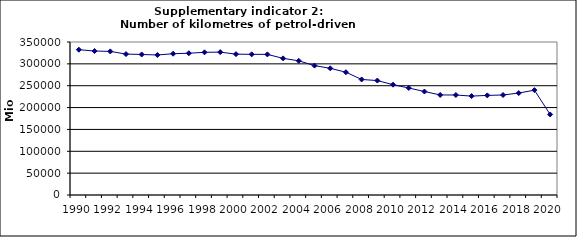
| Category | Number of kilometres of petrol-driven passenger cars, Mio km |
|---|---|
| 1990 | 332404.085 |
| 1991 | 329357.329 |
| 1992 | 328515.51 |
| 1993 | 322404.141 |
| 1994 | 321470.751 |
| 1995 | 320281.468 |
| 1996 | 323220.494 |
| 1997 | 324332.975 |
| 1998 | 326378.653 |
| 1999 | 326862.708 |
| 2000 | 322196.513 |
| 2001 | 321766.928 |
| 2002 | 321659.897 |
| 2003 | 312589.065 |
| 2004 | 306929.059 |
| 2005 | 295995.741 |
| 2006 | 289814.797 |
| 2007 | 280880.374 |
| 2008 | 264312.431 |
| 2009 | 261770.955 |
| 2010 | 252343.487 |
| 2011 | 244803.612 |
| 2012 | 236697.433 |
| 2013 | 228918.303 |
| 2014 | 228734.363 |
| 2015 | 226254.913 |
| 2016 | 227862.961 |
| 2017 | 228767.861 |
| 2018 | 233220.806 |
| 2019 | 239845.157 |
| 2020 | 184283.261 |